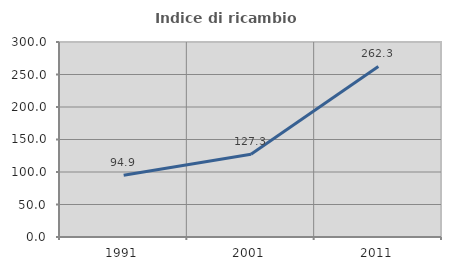
| Category | Indice di ricambio occupazionale  |
|---|---|
| 1991.0 | 94.949 |
| 2001.0 | 127.309 |
| 2011.0 | 262.346 |